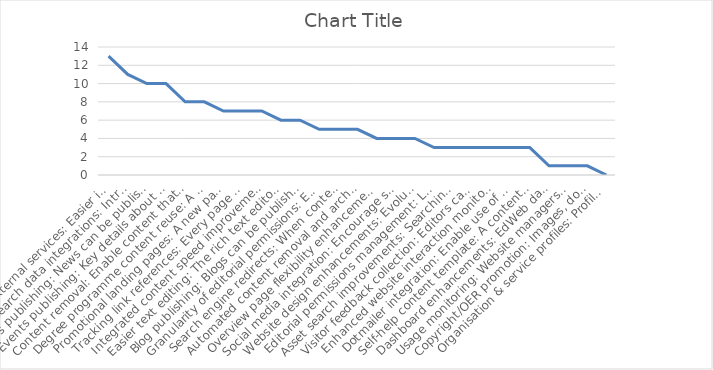
| Category | Series 0 |
|---|---|
| Integrating external services: Easier integration of services such as Google Maps, You Tube videos, Twitter feeds. Simple URL pasting into EdWeb with no need for interaction with HTML or assets. | 13 |
| PURE research data integrations: Introduce more opportunities to present information from the Edinburgh Research Explorer in EdWeb-managed web pages, with no technical knowledge needed. (Currently only publication lists possible). | 11 |
| News publishing: News can be published using a dedicated content type (template); enhancing presentation on different device sizes, allowing more intelligent sharing and promotion in search results. | 10 |
| Events publishing: Key details about events can be displayed differently in different contexts, such as the automatic creation of an events calendar. | 10 |
| Content removal: Enable content that is no longer required or created in error to be removable, reducing unnecessary clutter in the EdWeb content tree for editors. | 8 |
| Degree programme content reuse: A means to re-use and extend golden copy content about degree programmes, that is currently published only via the Degree Finder | 8 |
| Promotional landing pages: A new page type designed for promotional impact and flexibility, which can be used at any point in a site structure. It will work much like a Generic Content page, but have presentational features similar to a homepage. | 7 |
| Tracking link references: Every page will contain a list of all other EdWeb pages that link to it, so that when it is edited, moved or removed the editor is aware of the impact of their actions on other publishers across the University. | 7 |
| Integrated content speed improvements: Speed up page load times for content being delivered from external systems through EdWeb. | 7 |
| Easier text editing: The rich text editor is improved, so that it's quicker and easier to make changes to content, to apply stand-out formatting elements and to ensure everything is standards compliant. | 6 |
| Blog publishing: Blogs can be published via EdWeb, with sufficient design changes to distinguish from corporate web content, and new navigation and filtering options typically associated with this kind of content (sort by author, by date, by tag etc). | 6 |
| Granularity of editorial permissions: Editing rights can be restricted to particular subsections or content types, rather than having access to everything in a particular site. | 5 |
| Search engine redirects: When content is moved or removed, enable 301 redirects. This reduces the risk of a website visitor receiving a 'Page not found' error from a search result in the period before the site is re-indexed. | 5 |
| Automated content removal and archiving: Schedule archiving and permanent removal of unpublished content after given periods to reduce unnecessary clutter and support compliance with records management legislation. | 5 |
| Overview page flexibility enhancements: Introduce new layout options to enable overview pages to dynamically present the content below in a range of ways. | 4 |
| Social media integration: Encourage sharing of website content via social media buttons, and features to monitor engagement on popular networks. | 4 |
| Website design enhancements: Evolution of design to improve website visitor experience on small devices, bringing greater focus to content over brand & navigation elements and promoting clearer/easier interactions. | 4 |
| Editorial permissions management: Lead publishers can assign editorial rights on their website to any trained user, without involving EdWeb support. | 3 |
| Asset search improvements: Searching for images, documents, videos, content snippets etc is quicker, easier and more efficient. | 3 |
| Visitor feedback collection: Editors can collect and view visitor ratings for page content, to identify strengths and quickly correct any errors. | 3 |
| Enhanced website interaction monitoring: Enable use of analytics tools (click heat tracking, A/B testing etc) that provide additional insight into how website visitors are interacting with the website. This informs ongoing content & design improvements. | 3 |
| Dotmailer integration: Enable use of Dotmailer through EdWeb as a means to build and manage mailing lists more efficiently. | 3 |
| Self-help content template: A content type (template) optimised for presentation of online help and guidance, supporting user self service. | 3 |
| Dashboard enhancements: EdWeb dashboard is more useful to editors and publishers, speeding up completion of the most common tasks, and can be configured to suit an individual's priorities. | 1 |
| Usage monitoring: Website managers and EdWeb support services have access to data on editorial and publishing activity, which will support better website management, staffing and user support-related decision making. | 1 |
| Copyright/OER promotion: Images, documents and other assets can be promoted as Open Educational Resources, encouraging reuse of University materials worldwide. | 1 |
| Organisation & service profiles: Profiles can be published using a dedicated content type (template); enhancing presentation on different device sizes, allowing more intelligent sharing and promotion in search results. | 0 |